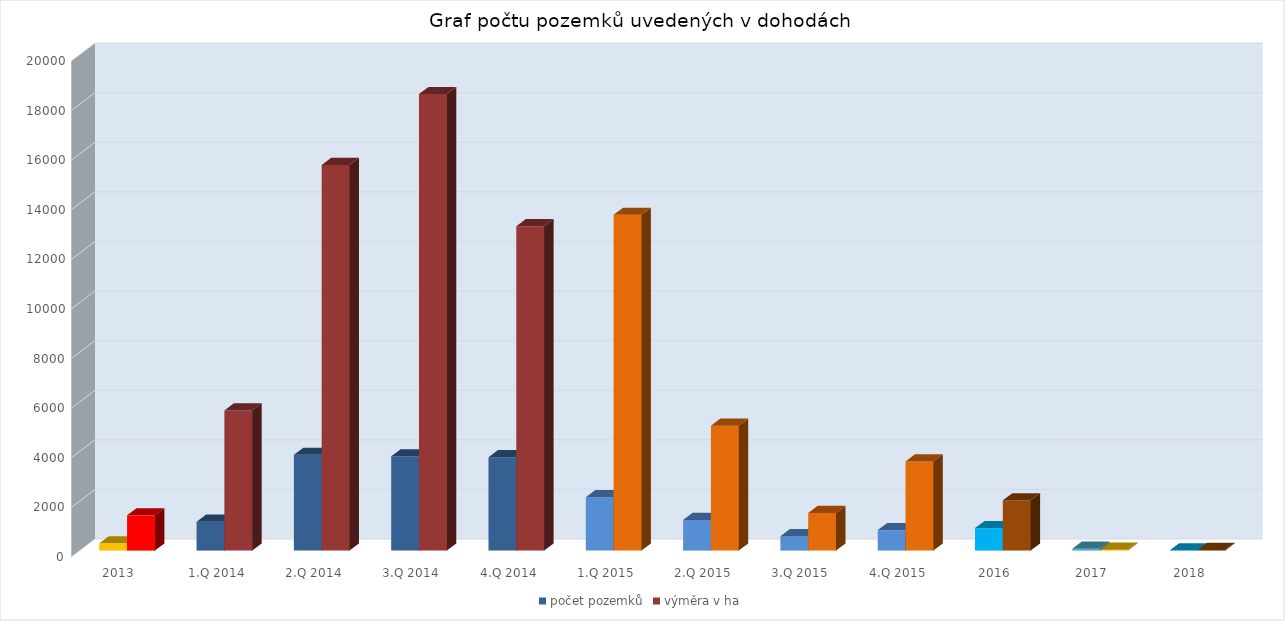
| Category | počet pozemků | výměra v ha |
|---|---|---|
| 2013 | 293 | 1422 |
| 1.Q 2014 | 1164 | 5651 |
| 2.Q 2014 | 3860 | 15549 |
| 3.Q 2014 | 3800 | 18406 |
| 4.Q 2014 | 3763 | 13077 |
| 1.Q 2015 | 2154 | 13537 |
| 2.Q 2015 | 1234 | 5032 |
| 3.Q 2015 | 583 | 1518 |
| 4.Q 2015 | 826 | 3597 |
| 2016 | 907 | 2027 |
| 2017 | 78 | 35 |
| 2018 | 2 | 25 |